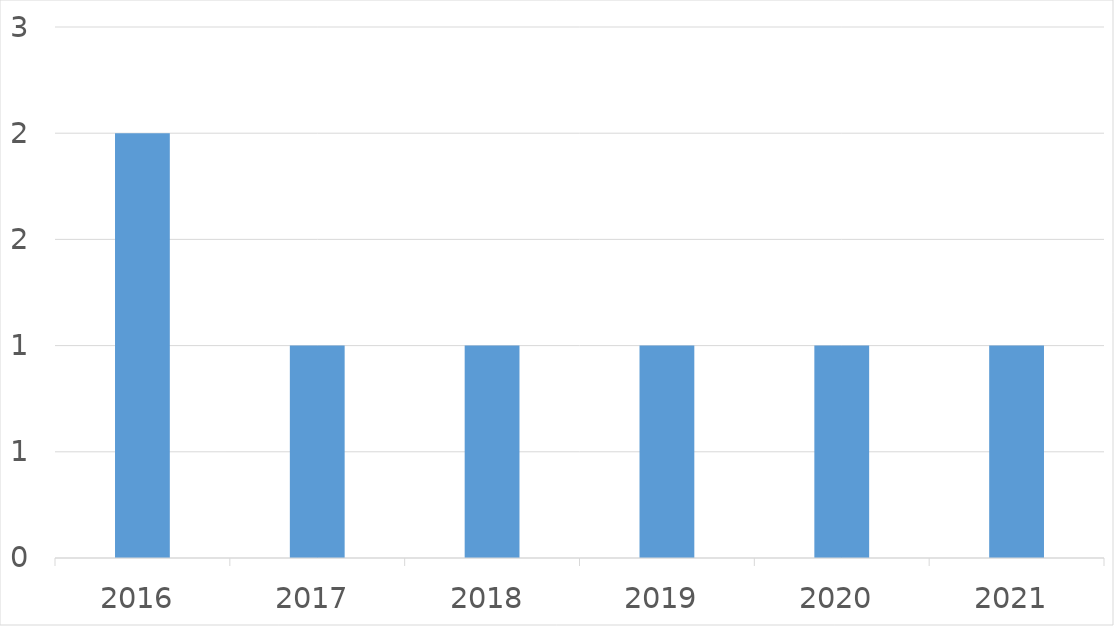
| Category | Series 0 |
|---|---|
| 2016 | 2 |
| 2017 | 1 |
| 2018 | 1 |
| 2019 | 1 |
| 2020 | 1 |
| 2021 | 1 |